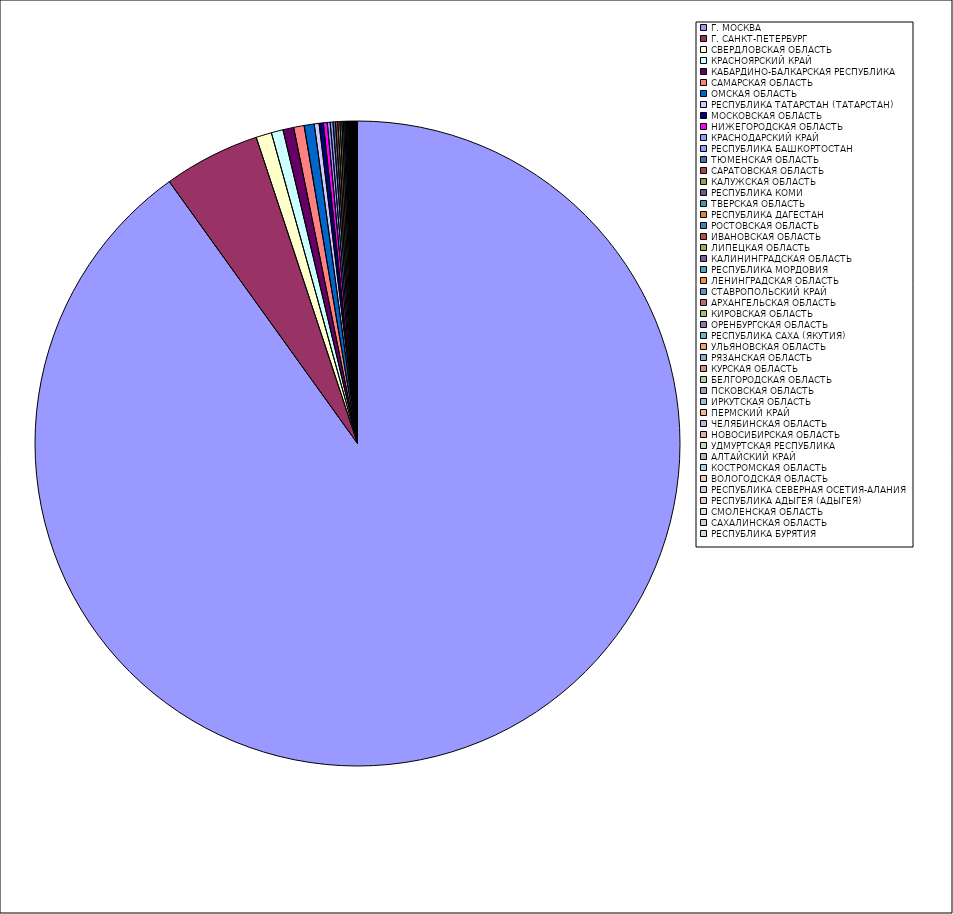
| Category | Оборот |
|---|---|
| Г. МОСКВА | 90.051 |
| Г. САНКТ-ПЕТЕРБУРГ | 4.833 |
| СВЕРДЛОВСКАЯ ОБЛАСТЬ | 0.78 |
| КРАСНОЯРСКИЙ КРАЙ | 0.59 |
| КАБАРДИНО-БАЛКАРСКАЯ РЕСПУБЛИКА | 0.541 |
| САМАРСКАЯ ОБЛАСТЬ | 0.523 |
| ОМСКАЯ ОБЛАСТЬ | 0.504 |
| РЕСПУБЛИКА ТАТАРСТАН (ТАТАРСТАН) | 0.242 |
| МОСКОВСКАЯ ОБЛАСТЬ | 0.212 |
| НИЖЕГОРОДСКАЯ ОБЛАСТЬ | 0.194 |
| КРАСНОДАРСКИЙ КРАЙ | 0.145 |
| РЕСПУБЛИКА БАШКОРТОСТАН | 0.14 |
| ТЮМЕНСКАЯ ОБЛАСТЬ | 0.121 |
| САРАТОВСКАЯ ОБЛАСТЬ | 0.116 |
| КАЛУЖСКАЯ ОБЛАСТЬ | 0.103 |
| РЕСПУБЛИКА КОМИ | 0.102 |
| ТВЕРСКАЯ ОБЛАСТЬ | 0.074 |
| РЕСПУБЛИКА ДАГЕСТАН | 0.062 |
| РОСТОВСКАЯ ОБЛАСТЬ | 0.05 |
| ИВАНОВСКАЯ ОБЛАСТЬ | 0.047 |
| ЛИПЕЦКАЯ ОБЛАСТЬ | 0.045 |
| КАЛИНИНГРАДСКАЯ ОБЛАСТЬ | 0.044 |
| РЕСПУБЛИКА МОРДОВИЯ | 0.039 |
| ЛЕНИНГРАДСКАЯ ОБЛАСТЬ | 0.037 |
| СТАВРОПОЛЬСКИЙ КРАЙ | 0.028 |
| АРХАНГЕЛЬСКАЯ ОБЛАСТЬ | 0.027 |
| КИРОВСКАЯ ОБЛАСТЬ | 0.026 |
| ОРЕНБУРГСКАЯ ОБЛАСТЬ | 0.024 |
| РЕСПУБЛИКА САХА (ЯКУТИЯ) | 0.023 |
| УЛЬЯНОВСКАЯ ОБЛАСТЬ | 0.021 |
| РЯЗАНСКАЯ ОБЛАСТЬ | 0.02 |
| КУРСКАЯ ОБЛАСТЬ | 0.018 |
| БЕЛГОРОДСКАЯ ОБЛАСТЬ | 0.018 |
| ПСКОВСКАЯ ОБЛАСТЬ | 0.018 |
| ИРКУТСКАЯ ОБЛАСТЬ | 0.017 |
| ПЕРМСКИЙ КРАЙ | 0.016 |
| ЧЕЛЯБИНСКАЯ ОБЛАСТЬ | 0.016 |
| НОВОСИБИРСКАЯ ОБЛАСТЬ | 0.015 |
| УДМУРТСКАЯ РЕСПУБЛИКА | 0.015 |
| АЛТАЙСКИЙ КРАЙ | 0.013 |
| КОСТРОМСКАЯ ОБЛАСТЬ | 0.011 |
| ВОЛОГОДСКАЯ ОБЛАСТЬ | 0.011 |
| РЕСПУБЛИКА СЕВЕРНАЯ ОСЕТИЯ-АЛАНИЯ | 0.01 |
| РЕСПУБЛИКА АДЫГЕЯ (АДЫГЕЯ) | 0.009 |
| СМОЛЕНСКАЯ ОБЛАСТЬ | 0.006 |
| САХАЛИНСКАЯ ОБЛАСТЬ | 0.005 |
| РЕСПУБЛИКА БУРЯТИЯ | 0.005 |